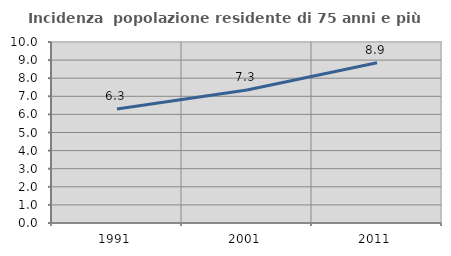
| Category | Incidenza  popolazione residente di 75 anni e più |
|---|---|
| 1991.0 | 6.294 |
| 2001.0 | 7.343 |
| 2011.0 | 8.854 |